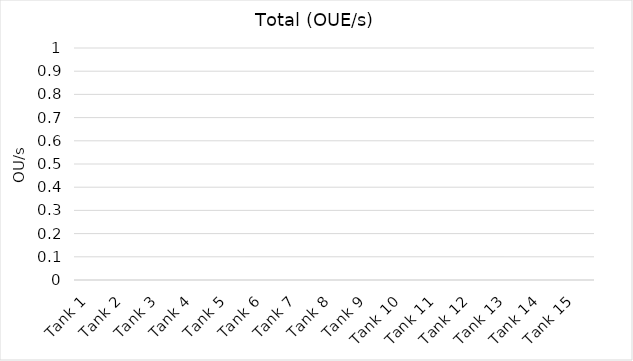
| Category | Total (OUE/s) |
|---|---|
| Tank 1 | 0 |
| Tank 2 | 0 |
| Tank 3 | 0 |
| Tank 4 | 0 |
| Tank 5 | 0 |
| Tank 6 | 0 |
| Tank 7 | 0 |
| Tank 8 | 0 |
| Tank 9 | 0 |
| Tank 10 | 0 |
| Tank 11 | 0 |
| Tank 12 | 0 |
| Tank 13 | 0 |
| Tank 14 | 0 |
| Tank 15 | 0 |